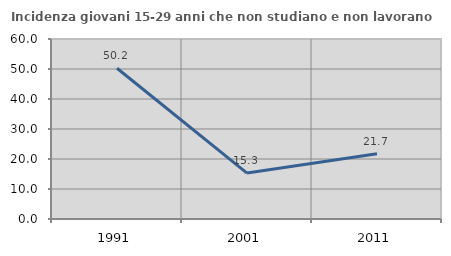
| Category | Incidenza giovani 15-29 anni che non studiano e non lavorano  |
|---|---|
| 1991.0 | 50.237 |
| 2001.0 | 15.306 |
| 2011.0 | 21.739 |